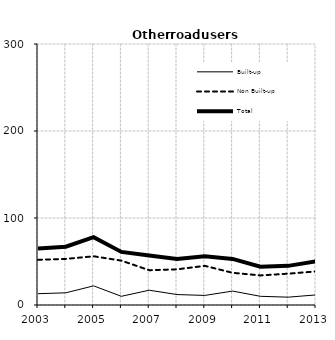
| Category | Built-up | Non Built-up | Total |
|---|---|---|---|
| 2003.0 | 13 | 52 | 65 |
| 2004.0 | 14 | 53 | 67 |
| 2005.0 | 22 | 56 | 78 |
| 2006.0 | 10 | 51 | 61 |
| 2007.0 | 17 | 40 | 57 |
| 2008.0 | 12 | 41 | 53 |
| 2009.0 | 11 | 45 | 56 |
| 2010.0 | 16 | 37 | 53 |
| 2011.0 | 10 | 34 | 44 |
| 2012.0 | 9 | 36 | 45 |
| 2013.0 | 11.6 | 38.6 | 50.2 |